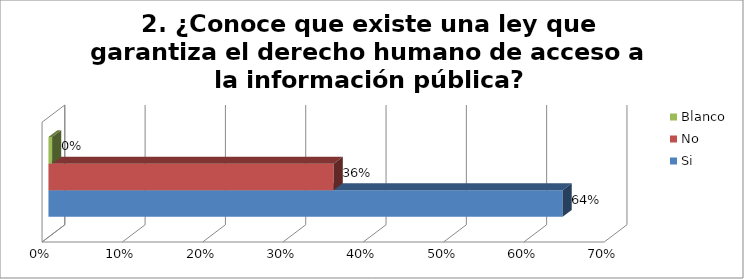
| Category | Si | No | Blanco |
|---|---|---|---|
| 0 | 0.64 | 0.355 | 0.005 |